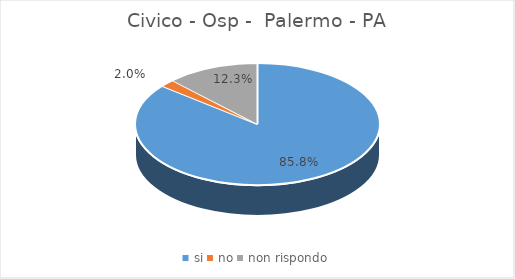
| Category | Civico - Osp -  Palermo - PA | Di Cristina (Ospedale dei Bambini) - Osp -  Palermo - PA |
|---|---|---|
| si | 0.858 | 0.836 |
| no | 0.02 | 0.012 |
| non rispondo | 0.123 | 0.152 |